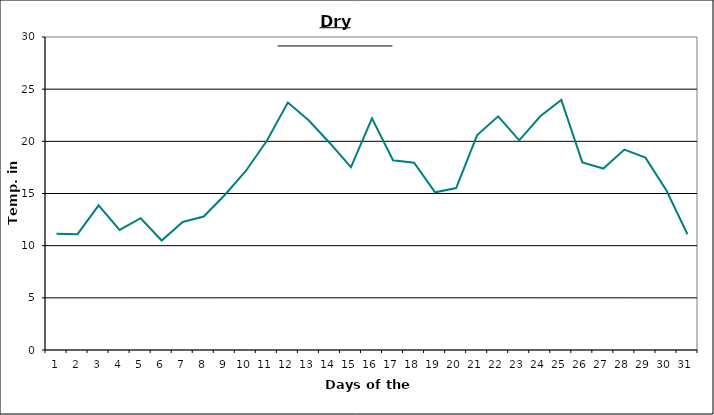
| Category | Series 0 |
|---|---|
| 0 | 11.15 |
| 1 | 11.1 |
| 2 | 13.87 |
| 3 | 11.51 |
| 4 | 12.63 |
| 5 | 10.49 |
| 6 | 12.27 |
| 7 | 12.79 |
| 8 | 14.86 |
| 9 | 17.16 |
| 10 | 20.05 |
| 11 | 23.72 |
| 12 | 21.99 |
| 13 | 19.82 |
| 14 | 17.53 |
| 15 | 22.2 |
| 16 | 18.18 |
| 17 | 17.95 |
| 18 | 15.11 |
| 19 | 15.52 |
| 20 | 20.6 |
| 21 | 22.4 |
| 22 | 20.1 |
| 23 | 22.4 |
| 24 | 23.97 |
| 25 | 17.98 |
| 26 | 17.39 |
| 27 | 19.21 |
| 28 | 18.44 |
| 29 | 15.28 |
| 30 | 11.09 |